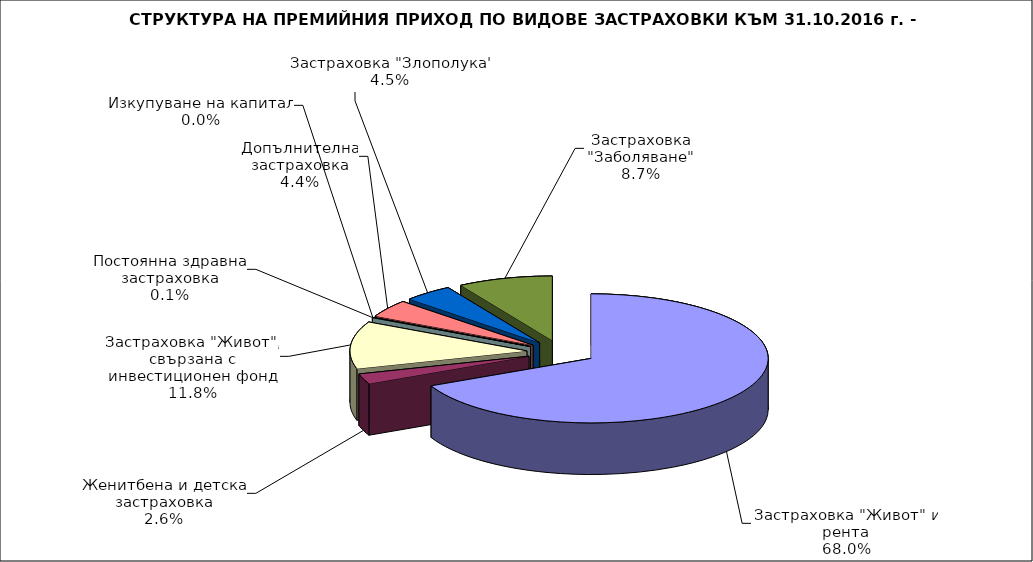
| Category | Series 0 |
|---|---|
| Застраховка "Живот" и рента | 0.68 |
| Женитбена и детска застраховка | 0.026 |
| Застраховка "Живот", свързана с инвестиционен фонд | 0.118 |
| Постоянна здравна застраховка | 0.001 |
| Изкупуване на капитал | 0 |
| Допълнителна застраховка | 0.044 |
| Застраховка "Злополука" | 0.045 |
| Застраховка "Заболяване" | 0.087 |